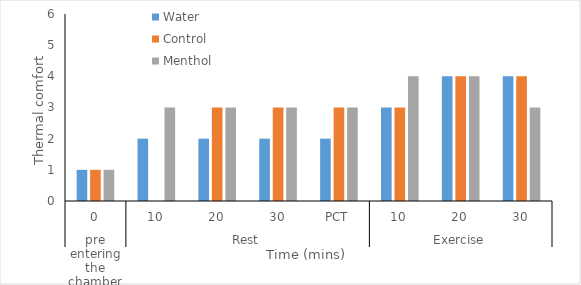
| Category | Water | Control | Menthol  |
|---|---|---|---|
| 0 | 1 | 1 | 1 |
| 1 | 2 | 0 | 3 |
| 2 | 2 | 3 | 3 |
| 3 | 2 | 3 | 3 |
| 4 | 2 | 3 | 3 |
| 5 | 3 | 3 | 4 |
| 6 | 4 | 4 | 4 |
| 7 | 4 | 4 | 3 |